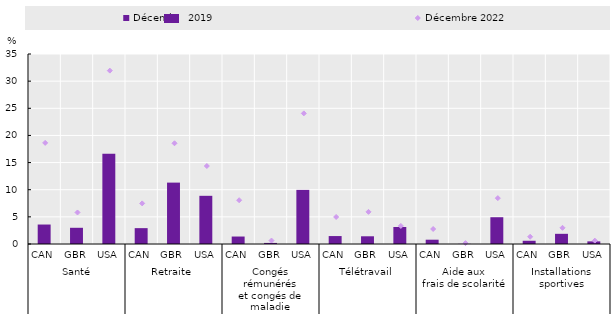
| Category | Décembre 2019 |
|---|---|
| 0 | 3.587 |
| 1 | 2.986 |
| 2 | 16.629 |
| 3 | 2.921 |
| 4 | 11.308 |
| 5 | 8.877 |
| 6 | 1.377 |
| 7 | 0.198 |
| 8 | 9.969 |
| 9 | 1.463 |
| 10 | 1.421 |
| 11 | 3.136 |
| 12 | 0.791 |
| 13 | 0.027 |
| 14 | 4.933 |
| 15 | 0.595 |
| 16 | 1.875 |
| 17 | 0.486 |